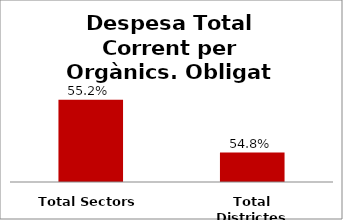
| Category | Series 0 |
|---|---|
| Total Sectors | 0.552 |
| Total Districtes | 0.548 |